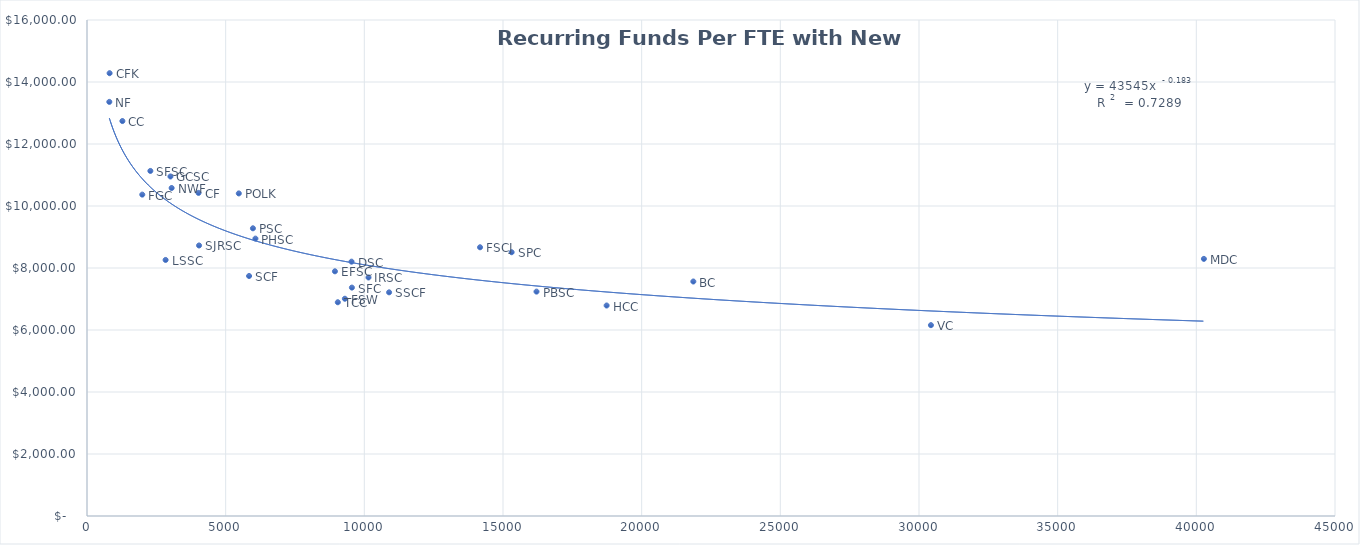
| Category | Total Funds Per FTE & New $  |
|---|---|
| 804.9 | 13358.373 |
| 815.1 | 14283.918 |
| 1276.4 | 12740.369 |
| 1993.2 | 10367.006 |
| 2284.9 | 11130.871 |
| 2834.2 | 8259.467 |
| 3009.0 | 10952.321 |
| 3051.9 | 10580.133 |
| 4021.1 | 10421.887 |
| 4040.3 | 8726.692 |
| 5473.6 | 10405.717 |
| 5844.3 | 7741.709 |
| 5983.3 | 9280.627 |
| 6073.3 | 8947.795 |
| 8940.3 | 7893.262 |
| 9043.7 | 6894.946 |
| 9298.5 | 7008.199 |
| 9538.7 | 8204.435 |
| 9551.9 | 7367.333 |
| 10150.0 | 7694.428 |
| 10892.9 | 7215.034 |
| 14172.4 | 8668.214 |
| 15311.3 | 8508.692 |
| 16208.1 | 7238.189 |
| 18736.5 | 6789.982 |
| 21862.8 | 7564.084 |
| 30430.4 | 6156.144 |
| 40272.8 | 8293.963 |